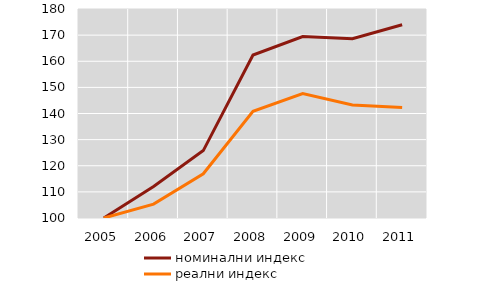
| Category | номинални индекс | реални индекс |
|---|---|---|
| 2005.0 | 100 | 100 |
| 2006.0 | 112.043 | 105.304 |
| 2007.0 | 125.806 | 116.92 |
| 2008.0 | 162.366 | 140.82 |
| 2009.0 | 169.462 | 147.615 |
| 2010.0 | 168.602 | 143.247 |
| 2011.0 | 173.978 | 142.256 |